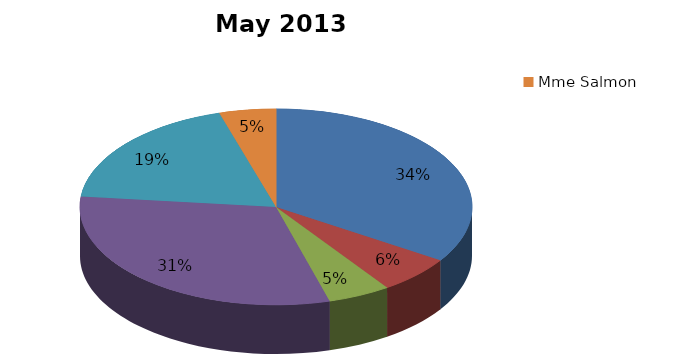
| Category | mai 2013 |
|---|---|
| Mme D'Harcourt | 330 |
| Mme Bertrand | 60 |
| Mlle Vanthomme | 50 |
| Mme Tercinier | 300 |
| Mme De Vilelle | 180 |
| Mme Salmon | 45 |